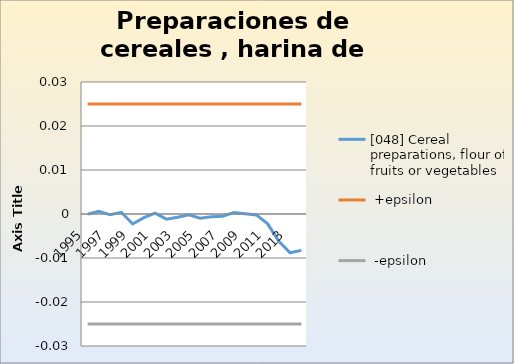
| Category | [048] Cereal preparations, flour of fruits or vegetables |  +epsilon |  -epsilon |
|---|---|---|---|
| 1995.0 | 0 | 0.025 | -0.025 |
| 1996.0 | 0.001 | 0.025 | -0.025 |
| 1997.0 | 0 | 0.025 | -0.025 |
| 1998.0 | 0 | 0.025 | -0.025 |
| 1999.0 | -0.002 | 0.025 | -0.025 |
| 2000.0 | -0.001 | 0.025 | -0.025 |
| 2001.0 | 0 | 0.025 | -0.025 |
| 2002.0 | -0.001 | 0.025 | -0.025 |
| 2003.0 | -0.001 | 0.025 | -0.025 |
| 2004.0 | 0 | 0.025 | -0.025 |
| 2005.0 | -0.001 | 0.025 | -0.025 |
| 2006.0 | -0.001 | 0.025 | -0.025 |
| 2007.0 | 0 | 0.025 | -0.025 |
| 2008.0 | 0 | 0.025 | -0.025 |
| 2009.0 | 0 | 0.025 | -0.025 |
| 2010.0 | 0 | 0.025 | -0.025 |
| 2011.0 | -0.002 | 0.025 | -0.025 |
| 2012.0 | -0.006 | 0.025 | -0.025 |
| 2013.0 | -0.009 | 0.025 | -0.025 |
| 2014.0 | -0.008 | 0.025 | -0.025 |